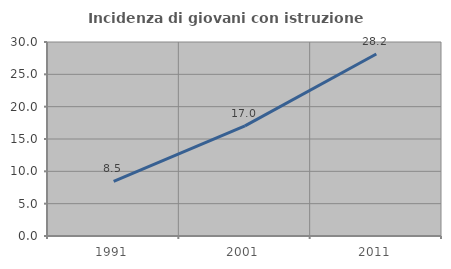
| Category | Incidenza di giovani con istruzione universitaria |
|---|---|
| 1991.0 | 8.451 |
| 2001.0 | 17.029 |
| 2011.0 | 28.151 |